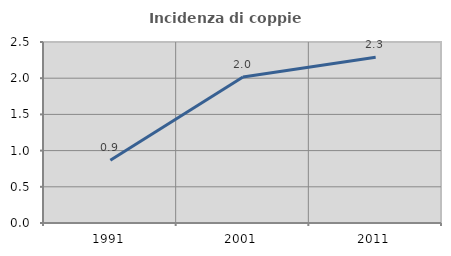
| Category | Incidenza di coppie miste |
|---|---|
| 1991.0 | 0.866 |
| 2001.0 | 2.016 |
| 2011.0 | 2.291 |